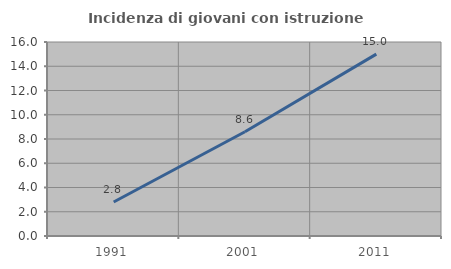
| Category | Incidenza di giovani con istruzione universitaria |
|---|---|
| 1991.0 | 2.804 |
| 2001.0 | 8.602 |
| 2011.0 | 15 |